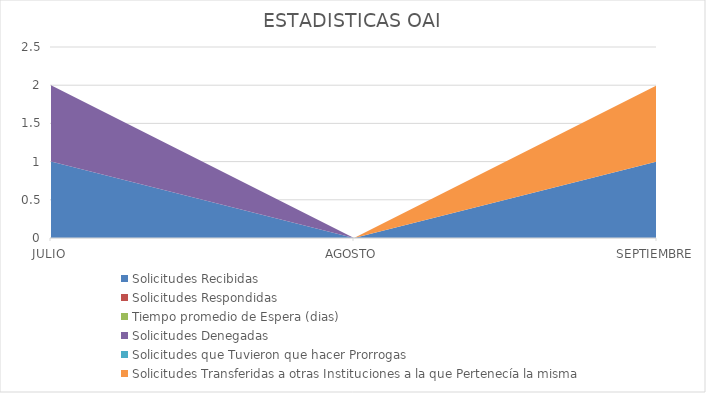
| Category | Solicitudes Recibidas | Solicitudes Respondidas | Tiempo promedio de Espera (dias) | Solicitudes Denegadas | Solicitudes que Tuvieron que hacer Prorrogas  | Solicitudes Transferidas a otras Instituciones a la que Pertenecía la misma |
|---|---|---|---|---|---|---|
| JULIO | 1 | 0 | 0 | 1 | 0 | 0 |
| AGOSTO | 0 | 0 | 0 | 0 | 0 | 0 |
| SEPTIEMBRE | 1 | 0 | 0 | 0 | 0 | 1 |